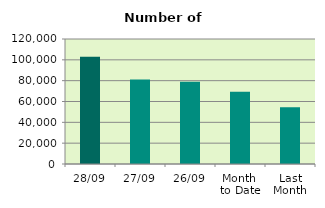
| Category | Series 0 |
|---|---|
| 28/09 | 103004 |
| 27/09 | 81086 |
| 26/09 | 78944 |
| Month 
to Date | 69360.8 |
| Last
Month | 54581.565 |